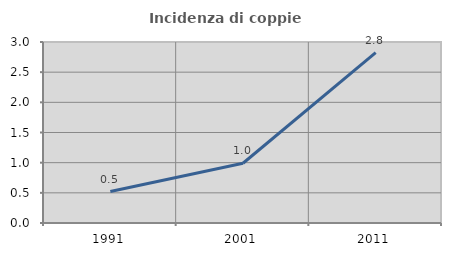
| Category | Incidenza di coppie miste |
|---|---|
| 1991.0 | 0.521 |
| 2001.0 | 0.99 |
| 2011.0 | 2.824 |